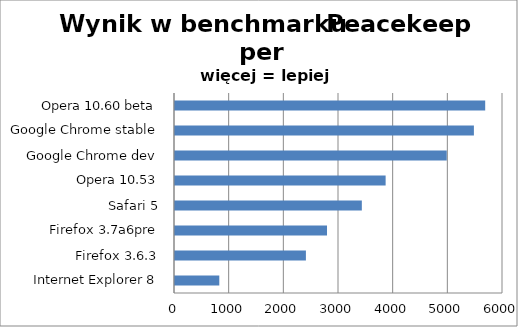
| Category | Series 0 |
|---|---|
| Internet Explorer 8 | 810.333 |
| Firefox 3.6.3 | 2394.667 |
| Firefox 3.7a6pre | 2780.667 |
| Safari 5 | 3417.667 |
| Opera 10.53 | 3853 |
| Google Chrome dev | 4970.667 |
| Google Chrome stable | 5467.667 |
| Opera 10.60 beta | 5674.333 |